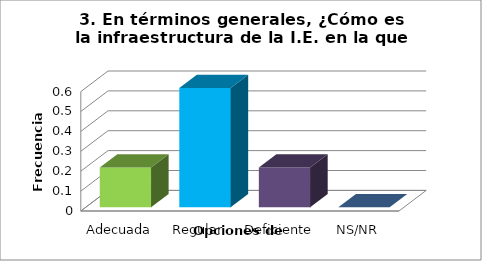
| Category | Adecuada Regular Deficiente NS/NR |
|---|---|
| Adecuada | 0.2 |
| Regular | 0.6 |
| Deficiente | 0.2 |
| NS/NR | 0 |